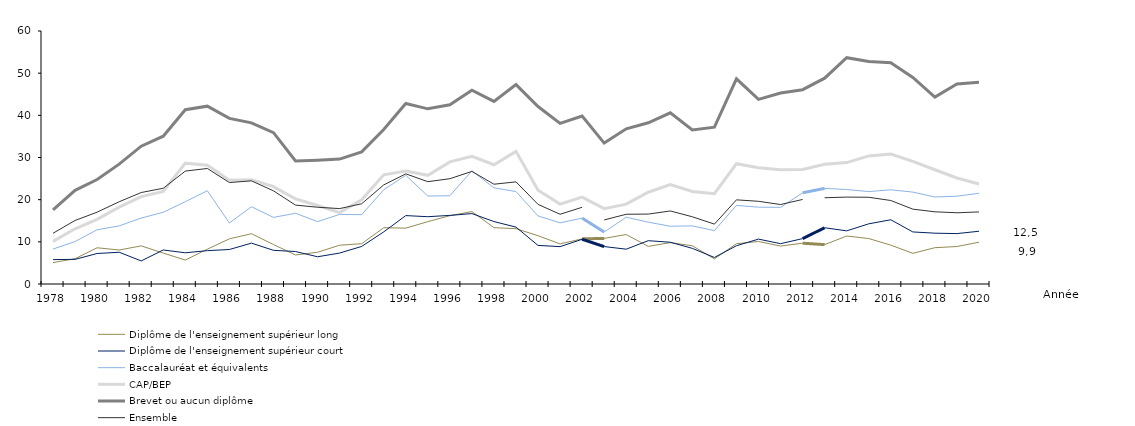
| Category | Diplôme de l'enseignement supérieur long | Diplôme de l'enseignement supérieur court | Baccalauréat et équivalents | CAP/BEP | Brevet ou aucun diplôme | Ensemble |
|---|---|---|---|---|---|---|
| 1978.0 | 5.08 | 5.79 | 8.29 | 10.11 | 17.57 | 12.035 |
| 1979.0 | 6 | 5.84 | 10.07 | 13.1 | 22.22 | 15.069 |
| 1980.0 | 8.59 | 7.23 | 12.86 | 15.33 | 24.77 | 17.037 |
| 1981.0 | 8.06 | 7.53 | 13.78 | 18.24 | 28.43 | 19.502 |
| 1982.0 | 9.04 | 5.47 | 15.64 | 20.73 | 32.68 | 21.694 |
| 1983.0 | 7.33 | 8.07 | 17.01 | 21.95 | 35.05 | 22.704 |
| 1984.0 | 5.68 | 7.4 | 19.52 | 28.65 | 41.33 | 26.777 |
| 1985.0 | 8.26 | 7.91 | 22.11 | 28.17 | 42.17 | 27.392 |
| 1986.0 | 10.71 | 8.18 | 14.46 | 24.58 | 39.28 | 24.061 |
| 1987.0 | 11.93 | 9.69 | 18.32 | 24.75 | 38.21 | 24.464 |
| 1988.0 | 9.36 | 7.99 | 15.8 | 23.08 | 35.89 | 22.09 |
| 1989.0 | 6.88 | 7.7 | 16.77 | 20.2 | 29.18 | 18.708 |
| 1990.0 | 7.53 | 6.46 | 14.8 | 18.62 | 29.37 | 18.203 |
| 1991.0 | 9.2 | 7.34 | 16.5 | 16.94 | 29.63 | 17.88 |
| 1992.0 | 9.56 | 8.91 | 16.44 | 19.96 | 31.33 | 19.028 |
| 1993.0 | 13.35 | 12.36 | 22.35 | 25.89 | 36.62 | 23.499 |
| 1994.0 | 13.25 | 16.22 | 25.78 | 26.8 | 42.8 | 26.125 |
| 1995.0 | 14.79 | 15.96 | 20.86 | 25.78 | 41.54 | 24.268 |
| 1996.0 | 16.19 | 16.27 | 20.93 | 28.96 | 42.51 | 24.968 |
| 1997.0 | 17.18 | 16.7 | 26.84 | 30.3 | 45.97 | 26.7 |
| 1998.0 | 13.36 | 14.81 | 22.81 | 28.28 | 43.31 | 23.667 |
| 1999.0 | 13.12 | 13.49 | 21.92 | 31.46 | 47.29 | 24.222 |
| 2000.0 | 11.45 | 9.15 | 16.14 | 22.24 | 42.09 | 18.881 |
| 2001.0 | 9.51 | 8.86 | 14.5 | 18.94 | 38.08 | 16.541 |
| 2002.0 | 10.7 | 10.6 | 15.62 | 20.6 | 39.83 | 18.201 |
| 2003.0 | 10.817 | 8.876 | 12.324 | 17.88 | 33.416 | 15.19 |
| 2004.0 | 11.731 | 8.259 | 15.839 | 18.931 | 36.803 | 16.54 |
| 2005.0 | 8.921 | 10.275 | 14.659 | 21.765 | 38.236 | 16.58 |
| 2006.0 | 9.812 | 9.904 | 13.696 | 23.572 | 40.588 | 17.32 |
| 2007.0 | 9.066 | 8.447 | 13.782 | 21.953 | 36.554 | 15.94 |
| 2008.0 | 5.955 | 6.293 | 12.659 | 21.432 | 37.19 | 14.2 |
| 2009.0 | 9.555 | 9.076 | 18.652 | 28.531 | 48.658 | 19.96 |
| 2010.0 | 10.084 | 10.642 | 18.218 | 27.589 | 43.792 | 19.61 |
| 2011.0 | 8.995 | 9.563 | 18.179 | 27.083 | 45.304 | 18.85 |
| 2012.0 | 9.679 | 10.767 | 21.628 | 27.161 | 46.082 | 20.05 |
| 2013.0 | 9.337 | 13.341 | 22.675 | 28.411 | 48.816 | 20.46 |
| 2014.0 | 11.376 | 12.603 | 22.405 | 28.794 | 53.674 | 20.61 |
| 2015.0 | 10.781 | 14.273 | 21.914 | 30.383 | 52.77 | 20.57 |
| 2016.0 | 9.219 | 15.231 | 22.336 | 30.824 | 52.467 | 19.8 |
| 2017.0 | 7.277 | 12.346 | 21.8 | 29.075 | 48.996 | 17.75 |
| 2018.0 | 8.611 | 12.052 | 20.629 | 27.099 | 44.341 | 17.12 |
| 2019.0 | 8.888 | 11.953 | 20.828 | 25.145 | 47.43 | 16.89 |
| 2020.0 | 9.915 | 12.51 | 21.507 | 23.728 | 47.819 | 17.09 |